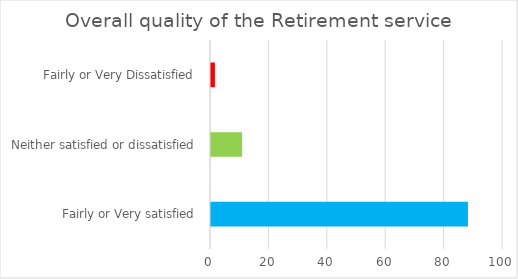
| Category | Series 0 |
|---|---|
| Fairly or Very satisfied | 88 |
| Neither satisfied or dissatisfied | 10.67 |
| Fairly or Very Dissatisfied | 1.33 |